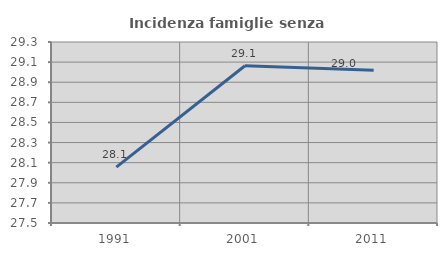
| Category | Incidenza famiglie senza nuclei |
|---|---|
| 1991.0 | 28.056 |
| 2001.0 | 29.064 |
| 2011.0 | 29.018 |